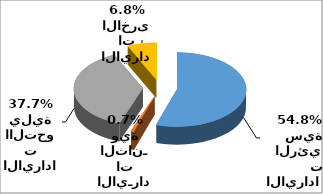
| Category | Series 0 |
|---|---|
| الايرادات الرئيسية | 6142082866 |
| الايـرادات الثانـوية | 80723347 |
| الايرادات االتحويلية | 4218267444 |
| الايرادات الاخرى | 762582108 |